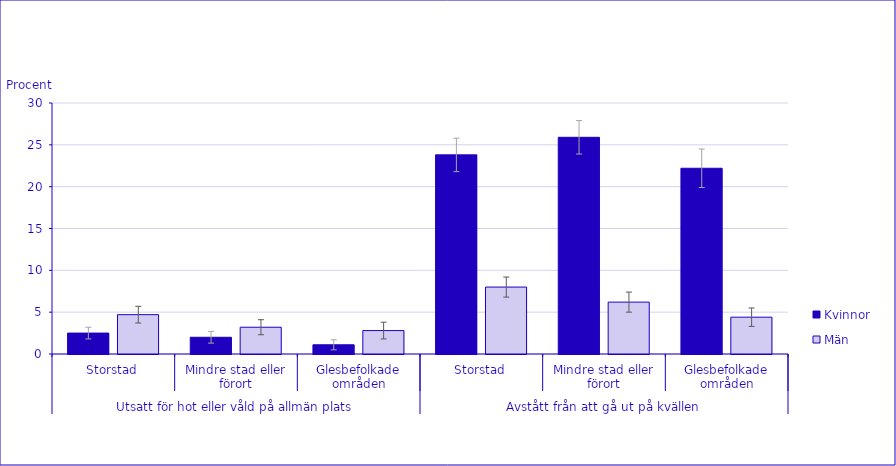
| Category | Kvinnor | Män |
|---|---|---|
| 0 | 2.5 | 4.7 |
| 1 | 2 | 3.2 |
| 2 | 1.1 | 2.8 |
| 3 | 23.8 | 8 |
| 4 | 25.9 | 6.2 |
| 5 | 22.2 | 4.4 |